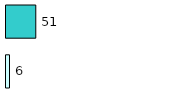
| Category | Series 0 | Series 1 |
|---|---|---|
| 0 | 6 | 51 |